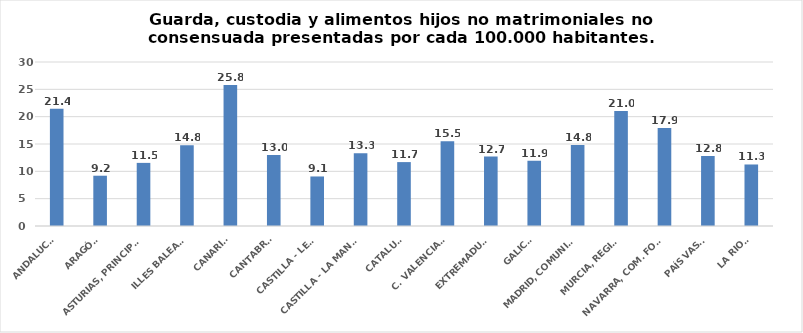
| Category | Series 0 |
|---|---|
| ANDALUCÍA | 21.434 |
| ARAGÓN | 9.198 |
| ASTURIAS, PRINCIPADO | 11.546 |
| ILLES BALEARS | 14.788 |
| CANARIAS | 25.807 |
| CANTABRIA | 12.983 |
| CASTILLA - LEÓN | 9.062 |
| CASTILLA - LA MANCHA | 13.295 |
| CATALUÑA | 11.691 |
| C. VALENCIANA | 15.496 |
| EXTREMADURA | 12.704 |
| GALICIA | 11.931 |
| MADRID, COMUNIDAD | 14.814 |
| MURCIA, REGIÓN | 21.02 |
| NAVARRA, COM. FORAL | 17.919 |
| PAÍS VASCO | 12.816 |
| LA RIOJA | 11.254 |